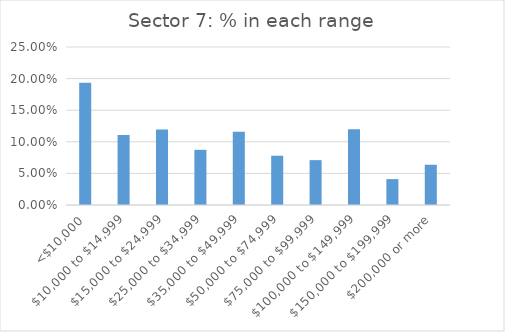
| Category | Series 0 |
|---|---|
| <$10,000 | 0.193 |
| $10,000 to $14,999 | 0.111 |
| $15,000 to $24,999 | 0.119 |
| $25,000 to $34,999 | 0.087 |
| $35,000 to $49,999 | 0.116 |
| $50,000 to $74,999 | 0.078 |
| $75,000 to $99,999 | 0.071 |
| $100,000 to $149,999 | 0.12 |
| $150,000 to $199,999 | 0.041 |
| $200,000 or more | 0.064 |